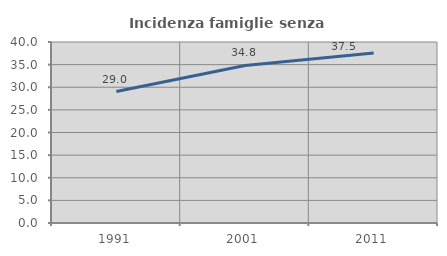
| Category | Incidenza famiglie senza nuclei |
|---|---|
| 1991.0 | 29.049 |
| 2001.0 | 34.82 |
| 2011.0 | 37.548 |